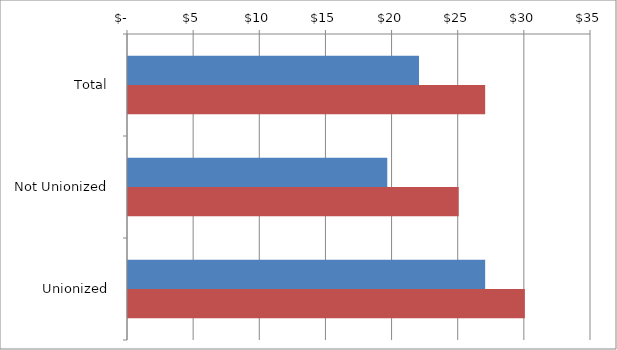
| Category | Series 0 | Series 1 |
|---|---|---|
| Total | 22 | 27 |
|  Not Unionized  | 19.6 | 25 |
|  Unionized  | 27 | 30 |